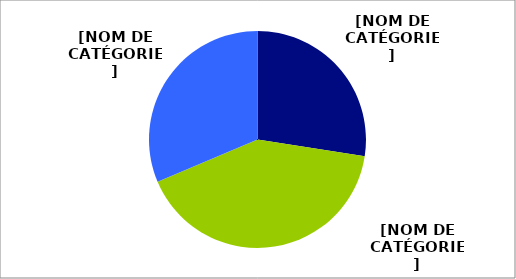
| Category | Series 0 |
|---|---|
| Donneur  | 14 |
| Patient autologue | 21 |
| Receveur | 16 |